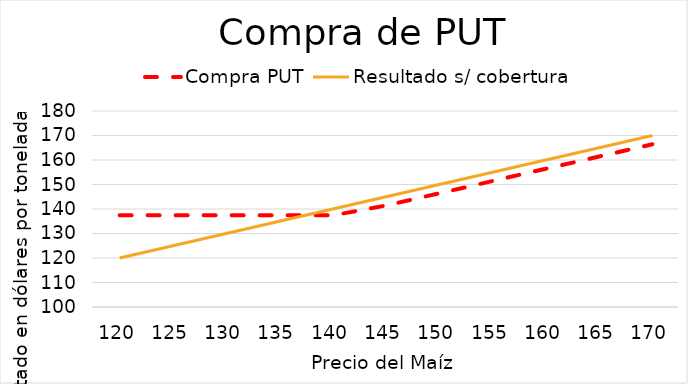
| Category | Compra PUT | Resultado s/ cobertura |
|---|---|---|
| 120.0 | 137.42 | 120 |
| 125.0 | 137.42 | 125 |
| 130.0 | 137.42 | 130 |
| 135.0 | 137.42 | 135 |
| 140.0 | 137.42 | 140 |
| 145.0 | 141.42 | 145 |
| 150.0 | 146.42 | 150 |
| 155.0 | 151.42 | 155 |
| 160.0 | 156.42 | 160 |
| 165.0 | 161.42 | 165 |
| 170.0 | 166.42 | 170 |